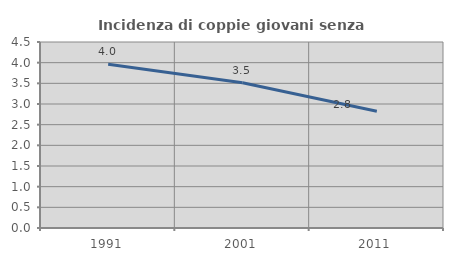
| Category | Incidenza di coppie giovani senza figli |
|---|---|
| 1991.0 | 3.959 |
| 2001.0 | 3.514 |
| 2011.0 | 2.825 |